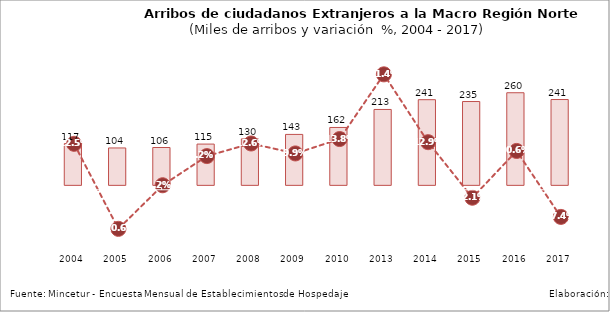
| Category | Series 0 |
|---|---|
| 2004.0 | 116.621 |
| 2005.0 | 104.244 |
| 2006.0 | 105.531 |
| 2007.0 | 115.202 |
| 2008.0 | 129.7 |
| 2009.0 | 142.514 |
| 2010.0 | 162.168 |
| 2013.0 | 213.051 |
| 2014.0 | 240.629 |
| 2015.0 | 235.459 |
| 2016.0 | 260.315 |
| 2017.0 | 241.139 |